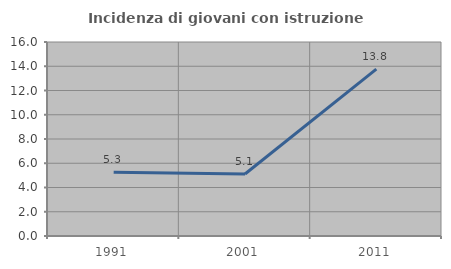
| Category | Incidenza di giovani con istruzione universitaria |
|---|---|
| 1991.0 | 5.263 |
| 2001.0 | 5.114 |
| 2011.0 | 13.768 |